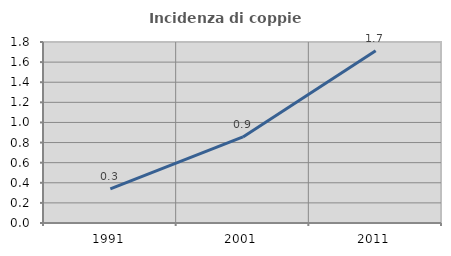
| Category | Incidenza di coppie miste |
|---|---|
| 1991.0 | 0.339 |
| 2001.0 | 0.856 |
| 2011.0 | 1.714 |